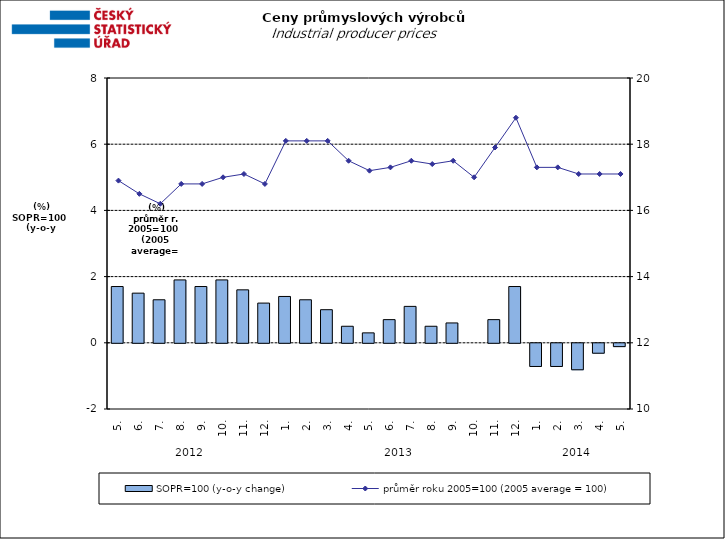
| Category | SOPR=100 (y-o-y change)   |
|---|---|
| 0 | 1.7 |
| 1 | 1.5 |
| 2 | 1.3 |
| 3 | 1.9 |
| 4 | 1.7 |
| 5 | 1.9 |
| 6 | 1.6 |
| 7 | 1.2 |
| 8 | 1.4 |
| 9 | 1.3 |
| 10 | 1 |
| 11 | 0.5 |
| 12 | 0.3 |
| 13 | 0.7 |
| 14 | 1.1 |
| 15 | 0.5 |
| 16 | 0.6 |
| 17 | 0 |
| 18 | 0.7 |
| 19 | 1.7 |
| 20 | -0.7 |
| 21 | -0.7 |
| 22 | -0.8 |
| 23 | -0.3 |
| 24 | -0.1 |